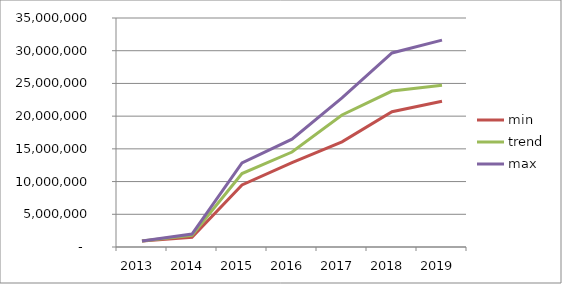
| Category |  min  |  trend  |  max  |
|---|---|---|---|
| 2013.0 | 904818.368 | 904818.368 | 904818.368 |
| 2014.0 | 1498518.514 | 1786225.727 | 1973027.463 |
| 2015.0 | 9492340.615 | 11231203.745 | 12841625.29 |
| 2016.0 | 12912894.159 | 14509883.967 | 16489704.708 |
| 2017.0 | 16065850.889 | 20177682.685 | 22805504.94 |
| 2018.0 | 20683282.308 | 23838696.304 | 29657759.276 |
| 2019.0 | 22263715.08 | 24728287.566 | 31617540.457 |